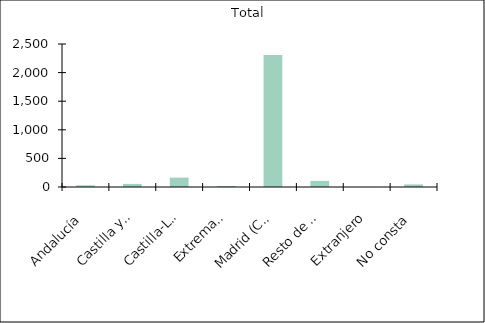
| Category | Total |
|---|---|
|    Andalucía | 29 |
|    Castilla y León | 54 |
|    Castilla-La Mancha | 164 |
|    Extremadura | 17 |
|    Madrid (Comunidad de) | 2306 |
|    Resto de CCAA | 107 |
|    Extranjero | 1 |
|    No consta | 45 |